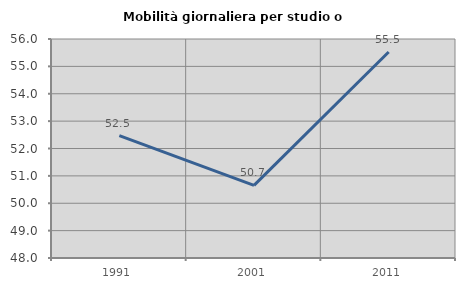
| Category | Mobilità giornaliera per studio o lavoro |
|---|---|
| 1991.0 | 52.47 |
| 2001.0 | 50.653 |
| 2011.0 | 55.524 |